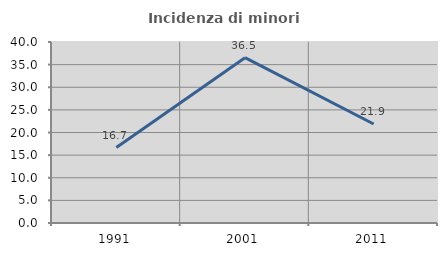
| Category | Incidenza di minori stranieri |
|---|---|
| 1991.0 | 16.667 |
| 2001.0 | 36.538 |
| 2011.0 | 21.875 |